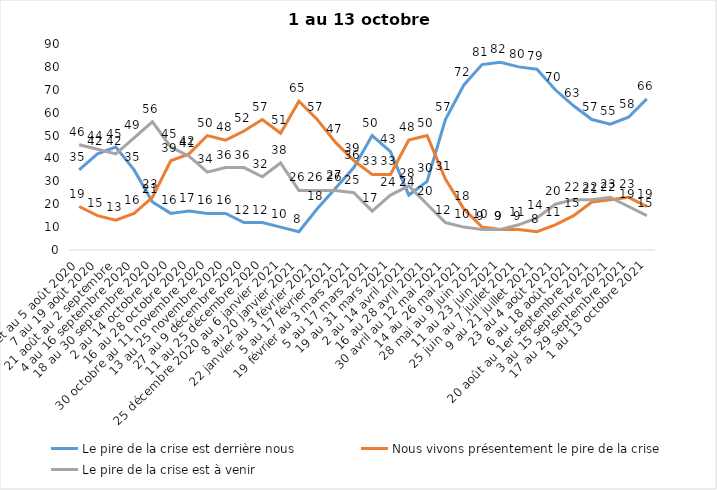
| Category | Le pire de la crise est derrière nous | Nous vivons présentement le pire de la crise | Le pire de la crise est à venir |
|---|---|---|---|
| 24 juillet au 5 août 2020 | 35 | 19 | 46 |
| 7 au 19 août 2020 | 42 | 15 | 44 |
| 21 août au 2 septembre | 45 | 13 | 42 |
| 4 au 16 septembre 2020 | 35 | 16 | 49 |
| 18 au 30 septembre 2020 | 21 | 23 | 56 |
| 2 au 14 octobre 2020 | 16 | 39 | 45 |
| 16 au 28 octobre 2020 | 17 | 42 | 41 |
| 30 octobre au 11 novembre 2020 | 16 | 50 | 34 |
| 13 au 25 novembre 2020 | 16 | 48 | 36 |
| 27 au 9 décembre 2020 | 12 | 52 | 36 |
| 11 au 25 décembre 2020 | 12 | 57 | 32 |
| 25 décembre 2020 au 6 janvier 2021 | 10 | 51 | 38 |
| 8 au 20 janvier 2021 | 8 | 65 | 26 |
| 22 janvier au 3 février 2021 | 18 | 57 | 26 |
| 5 au 17 février 2021 | 27 | 47 | 26 |
| 19 février au 3 mars 2021 | 36 | 39 | 25 |
| 5 au 17 mars 2021 | 50 | 33 | 17 |
| 19 au 31 mars 2021 | 43 | 33 | 24 |
| 2 au 14 avril 2021 | 24 | 48 | 28 |
| 16 au 28 avril 2021 | 30 | 50 | 20 |
| 30 avril au 12 mai 2021 | 57 | 31 | 12 |
| 14 au 26 mai 2021 | 72 | 18 | 10 |
| 28 mai au 9 juin 2021 | 81 | 10 | 9 |
| 11 au 23 juin 2021 | 82 | 9 | 9 |
| 25 juin au 7 juillet 2021 | 80 | 9 | 11 |
| 9 au 21 juillet 2021 | 79 | 8 | 14 |
| 23 au 4 août 2021 | 70 | 11 | 20 |
| 6 au 18 août 2021 | 63 | 15 | 22 |
| 20 août au 1er septembre 2021 | 57 | 21 | 22 |
| 3 au 15 septembre 2021 | 55 | 22 | 23 |
| 17 au 29 septembre 2021 | 58 | 23 | 19 |
| 1 au 13 octobre 2021 | 66 | 19 | 15 |